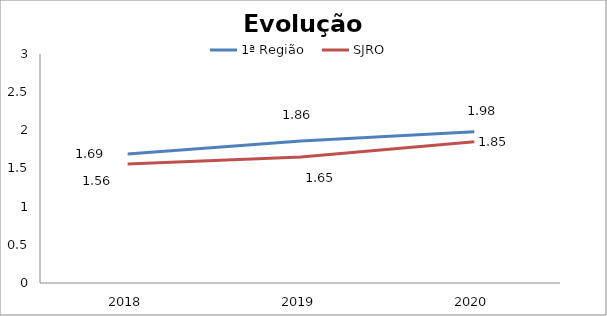
| Category | 1ª Região | SJRO |
|---|---|---|
| 0 | 1.69 | 1.56 |
| 1 | 1.86 | 1.65 |
| 2 | 1.98 | 1.85 |